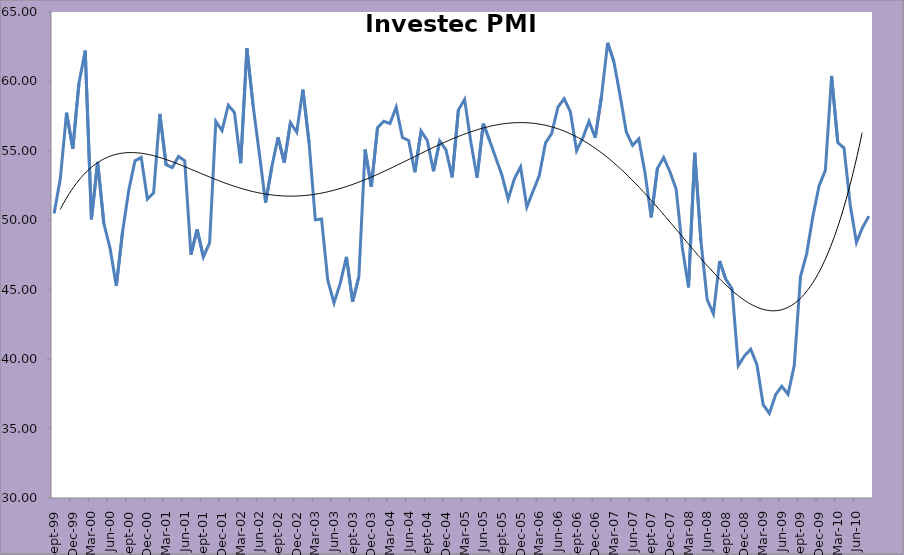
| Category | Investec PMI Survey |
|---|---|
| 1999-09-01 | 50.498 |
| 1999-10-01 | 53.005 |
| 1999-11-01 | 57.748 |
| 1999-12-01 | 55.143 |
| 2000-01-01 | 59.898 |
| 2000-02-01 | 62.218 |
| 2000-03-01 | 50.068 |
| 2000-04-01 | 54.199 |
| 2000-05-01 | 49.769 |
| 2000-06-01 | 47.974 |
| 2000-07-01 | 45.276 |
| 2000-08-01 | 49.16 |
| 2000-09-01 | 52.154 |
| 2000-10-01 | 54.282 |
| 2000-11-01 | 54.529 |
| 2000-12-01 | 51.528 |
| 2001-01-01 | 51.985 |
| 2001-02-01 | 57.658 |
| 2001-03-01 | 54.005 |
| 2001-04-01 | 53.794 |
| 2001-05-01 | 54.596 |
| 2001-06-01 | 54.29 |
| 2001-07-01 | 47.532 |
| 2001-08-01 | 49.332 |
| 2001-09-01 | 47.36 |
| 2001-10-01 | 48.38 |
| 2001-11-01 | 57.124 |
| 2001-12-01 | 56.455 |
| 2002-01-01 | 58.284 |
| 2002-02-01 | 57.762 |
| 2002-03-01 | 54.105 |
| 2002-04-01 | 62.375 |
| 2002-05-01 | 58.241 |
| 2002-06-01 | 54.788 |
| 2002-07-01 | 51.264 |
| 2002-08-01 | 53.84 |
| 2002-09-01 | 55.989 |
| 2002-10-01 | 54.161 |
| 2002-11-01 | 57.038 |
| 2002-12-01 | 56.344 |
| 2003-01-01 | 59.405 |
| 2003-02-01 | 55.554 |
| 2003-03-01 | 50.029 |
| 2003-04-01 | 50.096 |
| 2003-05-01 | 45.683 |
| 2003-06-01 | 44.053 |
| 2003-07-01 | 45.458 |
| 2003-08-01 | 47.365 |
| 2003-09-01 | 44.134 |
| 2003-10-01 | 45.941 |
| 2003-11-01 | 55.09 |
| 2003-12-01 | 52.412 |
| 2004-01-01 | 56.677 |
| 2004-02-04 | 57.128 |
| 2004-03-09 | 56.969 |
| 2004-04-12 | 58.155 |
| 2004-05-16 | 55.959 |
| 2004-06-19 | 55.751 |
| 2004-07-23 | 53.463 |
| 2004-08-26 | 56.431 |
| 2004-09-29 | 55.742 |
| 2004-10-02 | 53.528 |
| 2004-11-05 | 55.717 |
| 2004-12-09 | 55.08 |
| 2005-01-12 | 53.087 |
| 2005-02-15 | 57.945 |
| 2005-03-21 | 58.708 |
| 2005-04-24 | 55.642 |
| 2005-05-28 | 53.074 |
| 2005-06-01 | 56.957 |
| 2005-07-04 | 55.768 |
| 2005-08-06 | 54.504 |
| 2005-09-08 | 53.25 |
| 2005-10-11 | 51.524 |
| 2005-11-13 | 52.987 |
| 2005-12-16 | 53.847 |
| 2006-01-18 | 50.953 |
| 2006-02-20 | 52.093 |
| 2006-03-25 | 53.208 |
| 2006-04-25 | 55.563 |
| 2006-05-25 | 56.248 |
| 2006-06-25 | 58.142 |
| 2006-07-25 | 58.759 |
| 2006-08-01 | 57.824 |
| 2006-09-08 | 55.014 |
| 2006-10-01 | 55.916 |
| 2006-11-01 | 57.129 |
| 2006-12-01 | 55.944 |
| 2007-01-01 | 58.892 |
| 2007-02-01 | 62.783 |
| 2007-03-07 | 61.424 |
| 2007-04-07 | 58.977 |
| 2007-05-07 | 56.359 |
| 2007-06-07 | 55.4 |
| 2007-07-07 | 55.862 |
| 2007-08-07 | 53.433 |
| 2007-09-07 | 50.206 |
| 2007-10-07 | 53.734 |
| 2007-11-07 | 54.513 |
| 2007-12-07 | 53.516 |
| 2008-01-07 | 52.258 |
| 2008-02-07 | 48.028 |
| 2008-03-07 | 45.17 |
| 2008-04-07 | 54.86 |
| 2008-05-07 | 48.457 |
| 2008-06-07 | 44.285 |
| 2008-07-07 | 43.259 |
| 2008-08-07 | 47.067 |
| 2008-09-07 | 45.741 |
| 2008-10-07 | 45.069 |
| 2008-11-07 | 39.534 |
| 2008-12-07 | 40.241 |
| 2009-01-07 | 40.72 |
| 2009-02-07 | 39.603 |
| 2009-03-07 | 36.727 |
| 2009-04-07 | 36.089 |
| 2009-05-07 | 37.438 |
| 2009-06-07 | 38.043 |
| 2009-07-07 | 37.469 |
| 2009-08-07 | 39.548 |
| 2009-09-07 | 45.938 |
| 2009-10-07 | 47.6 |
| 2009-11-07 | 50.3 |
| 2009-12-07 | 52.5 |
| 2010-01-07 | 53.6 |
| 2010-02-07 | 60.4 |
| 2010-03-07 | 55.6 |
| 2010-04-07 | 55.2 |
| 2010-05-07 | 51.1 |
| 2010-06-07 | 48.4 |
| 2010-07-07 | 49.5 |
| 2010-08-07 | 50.3 |